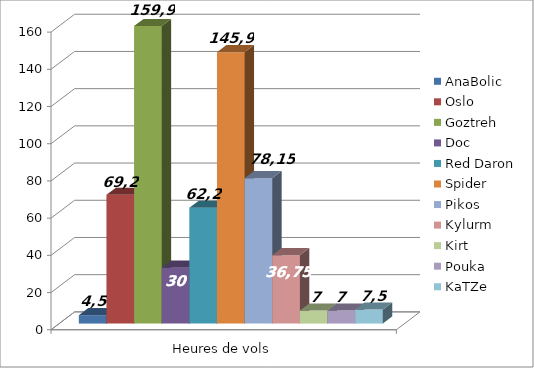
| Category | AnaBolic | Oslo | Goztreh | Doc | Red Daron | Spider | Pikos | Kylurm | Kirt | Pouka | KaTZe |
|---|---|---|---|---|---|---|---|---|---|---|---|
| 0 | 4.5 | 69.2 | 159.9 | 30 | 62.2 | 145.9 | 78.15 | 36.75 | 7 | 7 | 7.5 |